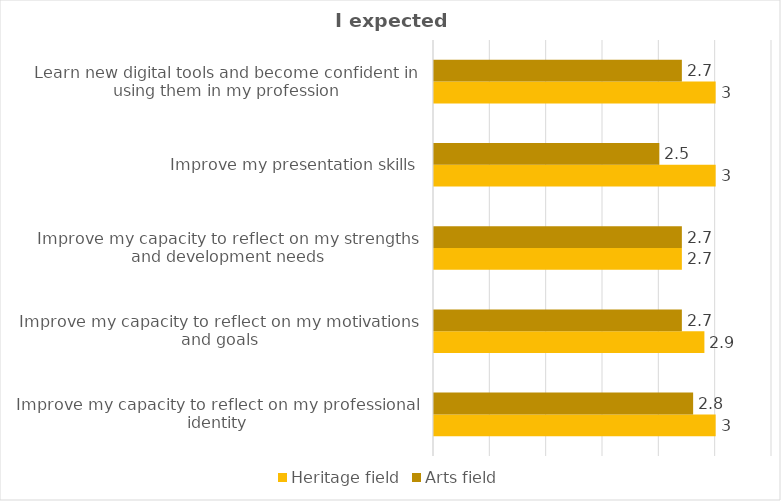
| Category | Heritage field | Arts field |
|---|---|---|
| Improve my capacity to reflect on my professional identity | 3 | 2.8 |
| Improve my capacity to reflect on my motivations and goals | 2.9 | 2.7 |
| Improve my capacity to reflect on my strengths and development needs | 2.7 | 2.7 |
| Improve my presentation skills | 3 | 2.5 |
| Learn new digital tools and become confident in using them in my profession | 3 | 2.7 |